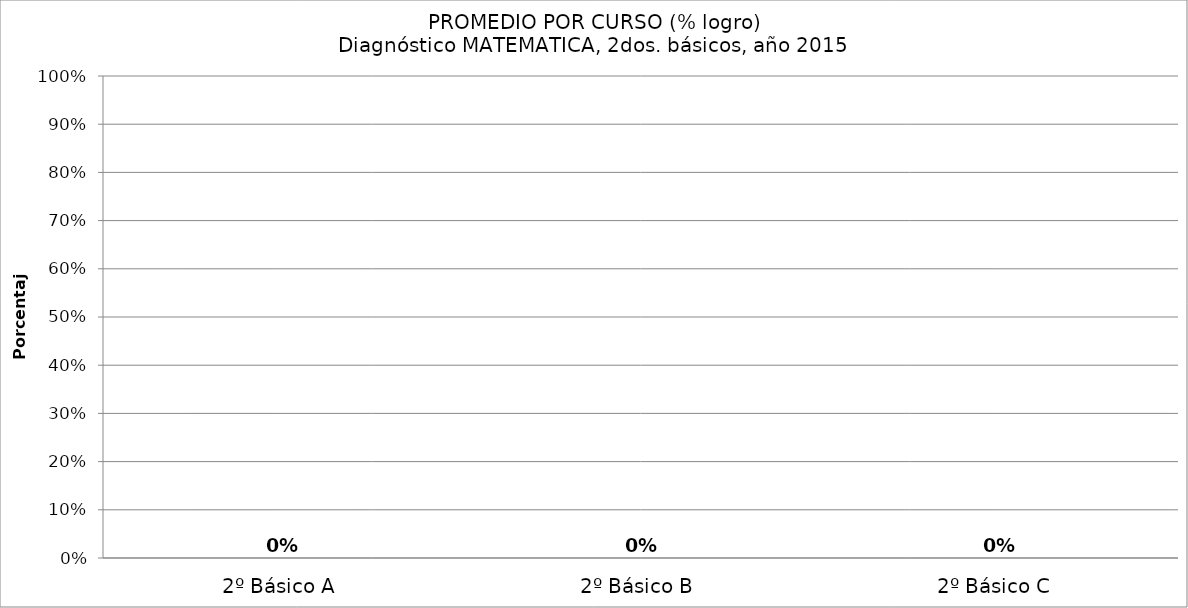
| Category | Series 0 |
|---|---|
| 2º Básico A | 0 |
| 2º Básico B | 0 |
| 2º Básico C | 0 |